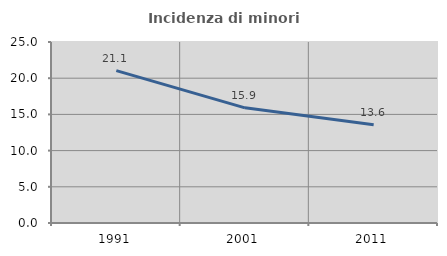
| Category | Incidenza di minori stranieri |
|---|---|
| 1991.0 | 21.053 |
| 2001.0 | 15.909 |
| 2011.0 | 13.569 |